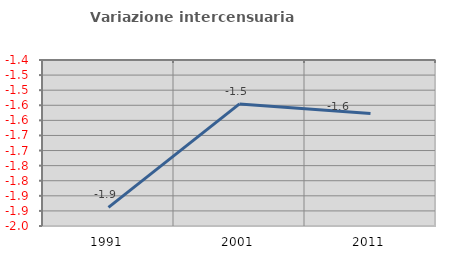
| Category | Variazione intercensuaria annua |
|---|---|
| 1991.0 | -1.888 |
| 2001.0 | -1.545 |
| 2011.0 | -1.577 |